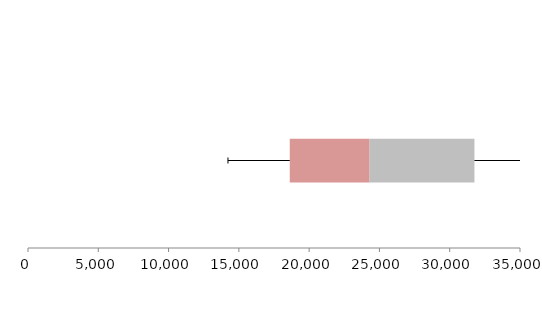
| Category | Series 1 | Series 2 | Series 3 |
|---|---|---|---|
| 0 | 18622.077 | 5680.162 | 7455.999 |